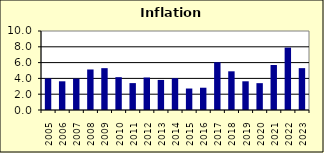
| Category | 4.6 |
|---|---|
| 2005.0 | 3.99 |
| 2006.0 | 3.633 |
| 2007.0 | 3.969 |
| 2008.0 | 5.129 |
| 2009.0 | 5.296 |
| 2010.0 | 4.155 |
| 2011.0 | 3.404 |
| 2012.0 | 4.111 |
| 2013.0 | 3.804 |
| 2014.0 | 4.019 |
| 2015.0 | 2.719 |
| 2016.0 | 2.82 |
| 2017.0 | 6.042 |
| 2018.0 | 4.897 |
| 2019.0 | 3.634 |
| 2020.0 | 3.398 |
| 2021.0 | 5.693 |
| 2022.0 | 7.899 |
| 2023.0 | 5.3 |